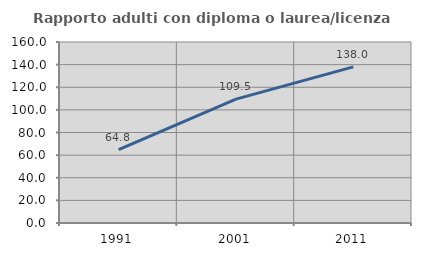
| Category | Rapporto adulti con diploma o laurea/licenza media  |
|---|---|
| 1991.0 | 64.826 |
| 2001.0 | 109.497 |
| 2011.0 | 138.012 |